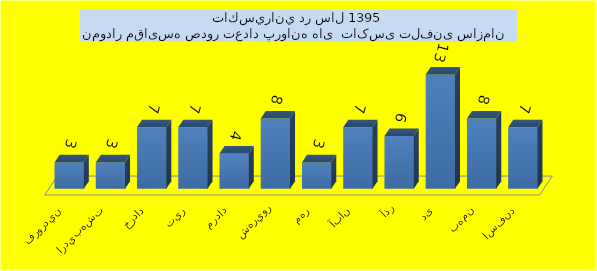
| Category | تعداد |
|---|---|
| فروردين | 3 |
| ارديبهشت | 3 |
| خرداد | 7 |
| تير | 7 |
| مرداد | 4 |
| شهريور | 8 |
| مهر | 3 |
| آبان | 7 |
| آذر | 6 |
| دی | 13 |
| بهمن | 8 |
| اسفند | 7 |